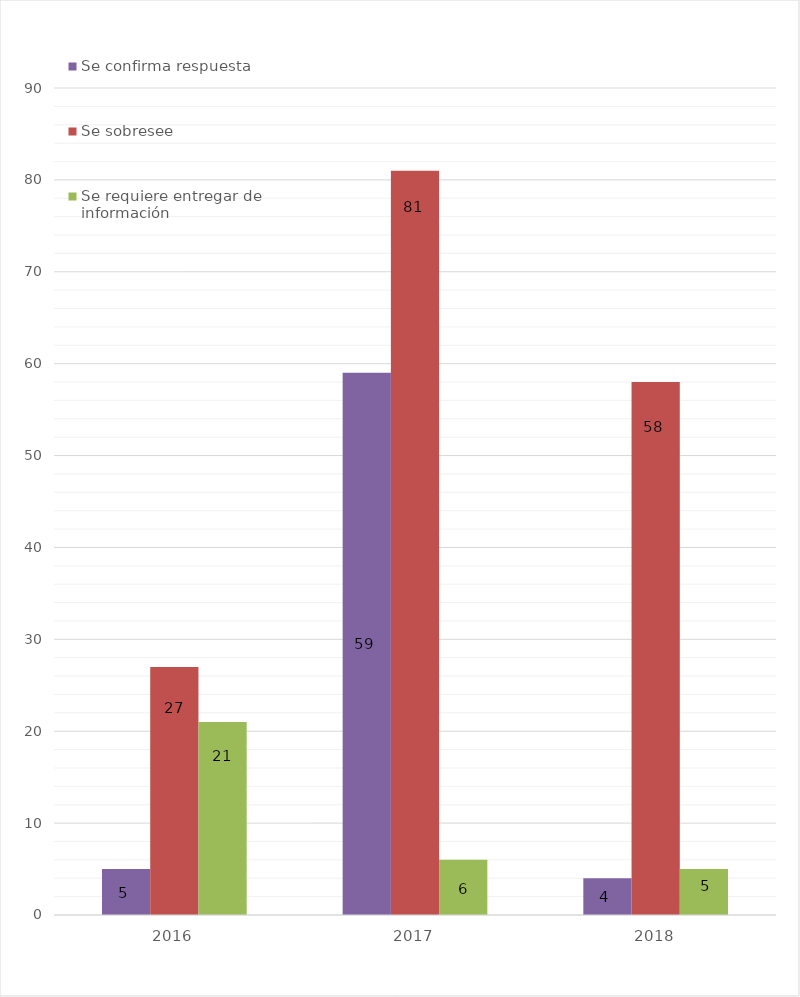
| Category | Se confirma respuesta | Se sobresee  | Se requiere entregar de información  |
|---|---|---|---|
| 2016.0 | 5 | 27 | 21 |
| 2017.0 | 59 | 81 | 6 |
| 2018.0 | 4 | 58 | 5 |